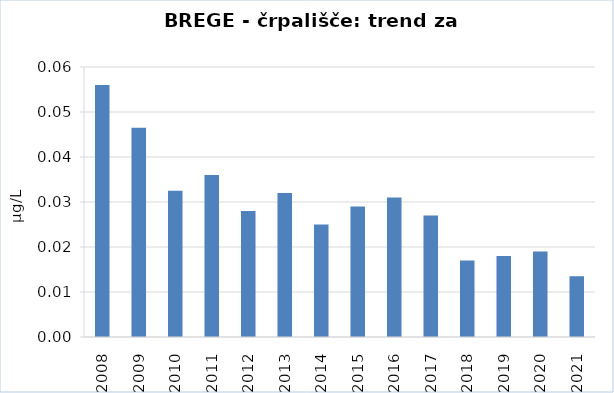
| Category | Vsota |
|---|---|
| 2008 | 0.056 |
| 2009 | 0.046 |
| 2010 | 0.032 |
| 2011 | 0.036 |
| 2012 | 0.028 |
| 2013 | 0.032 |
| 2014 | 0.025 |
| 2015 | 0.029 |
| 2016 | 0.031 |
| 2017 | 0.027 |
| 2018 | 0.017 |
| 2019 | 0.018 |
| 2020 | 0.019 |
| 2021 | 0.014 |